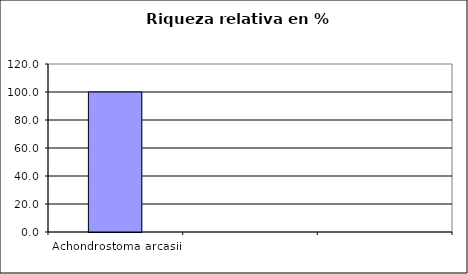
| Category | Series 0 |
|---|---|
| Achondrostoma arcasii | 100 |